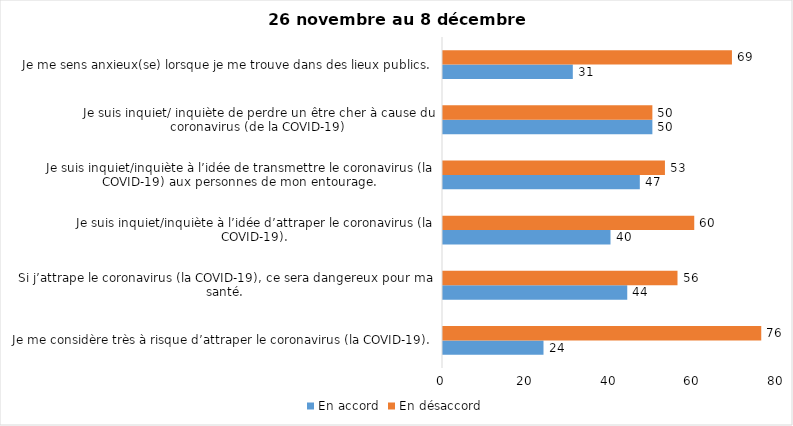
| Category | En accord | En désaccord |
|---|---|---|
| Je me considère très à risque d’attraper le coronavirus (la COVID-19). | 24 | 76 |
| Si j’attrape le coronavirus (la COVID-19), ce sera dangereux pour ma santé. | 44 | 56 |
| Je suis inquiet/inquiète à l’idée d’attraper le coronavirus (la COVID-19). | 40 | 60 |
| Je suis inquiet/inquiète à l’idée de transmettre le coronavirus (la COVID-19) aux personnes de mon entourage. | 47 | 53 |
| Je suis inquiet/ inquiète de perdre un être cher à cause du coronavirus (de la COVID-19) | 50 | 50 |
| Je me sens anxieux(se) lorsque je me trouve dans des lieux publics. | 31 | 69 |